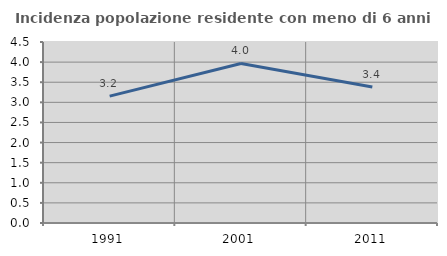
| Category | Incidenza popolazione residente con meno di 6 anni |
|---|---|
| 1991.0 | 3.155 |
| 2001.0 | 3.966 |
| 2011.0 | 3.38 |